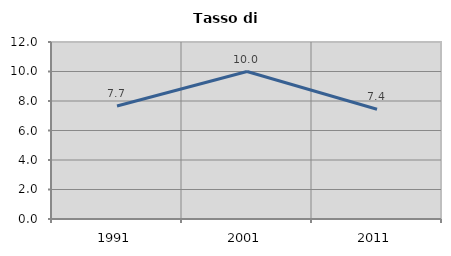
| Category | Tasso di disoccupazione   |
|---|---|
| 1991.0 | 7.66 |
| 2001.0 | 10 |
| 2011.0 | 7.438 |